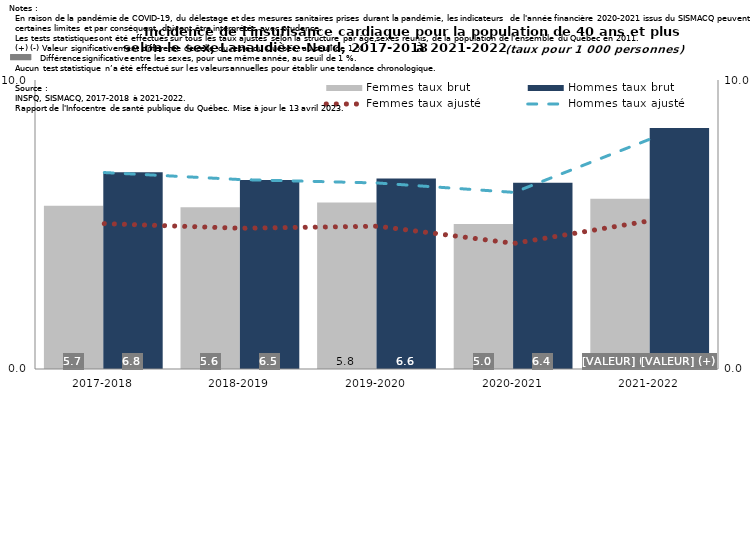
| Category | Femmes taux brut | Hommes taux brut |
|---|---|---|
| 2017-2018 | 5.652 | 6.804 |
| 2018-2019 | 5.595 | 6.541 |
| 2019-2020 | 5.763 | 6.594 |
| 2020-2021 | 5.016 | 6.443 |
| 2021-2022 | 5.89 | 8.338 |